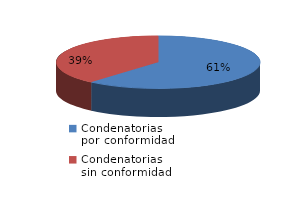
| Category | Series 0 |
|---|---|
| 0 | 19 |
| 1 | 12 |